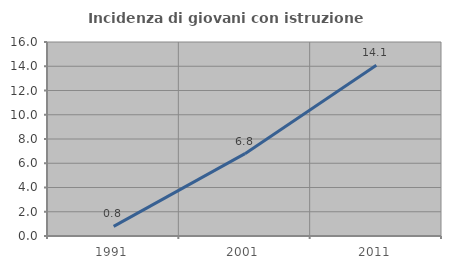
| Category | Incidenza di giovani con istruzione universitaria |
|---|---|
| 1991.0 | 0.794 |
| 2001.0 | 6.79 |
| 2011.0 | 14.085 |